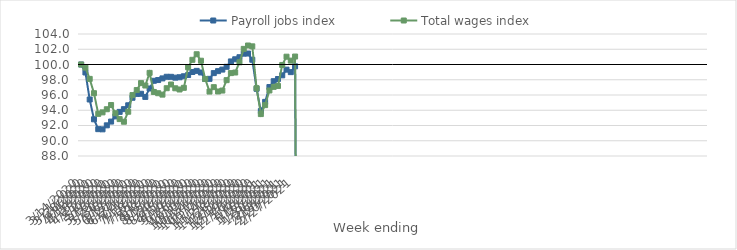
| Category | Payroll jobs index | Total wages index |
|---|---|---|
| 14/03/2020 | 100 | 100 |
| 21/03/2020 | 98.956 | 99.591 |
| 28/03/2020 | 95.412 | 98.115 |
| 04/04/2020 | 92.813 | 96.238 |
| 11/04/2020 | 91.52 | 93.527 |
| 18/04/2020 | 91.497 | 93.722 |
| 25/04/2020 | 92.022 | 94.132 |
| 02/05/2020 | 92.516 | 94.683 |
| 09/05/2020 | 93.196 | 93.606 |
| 16/05/2020 | 93.786 | 92.839 |
| 23/05/2020 | 94.143 | 92.495 |
| 30/05/2020 | 94.652 | 93.805 |
| 06/06/2020 | 95.638 | 95.989 |
| 13/06/2020 | 96.141 | 96.647 |
| 20/06/2020 | 96.161 | 97.556 |
| 27/06/2020 | 95.749 | 97.243 |
| 04/07/2020 | 96.855 | 98.903 |
| 11/07/2020 | 97.864 | 96.396 |
| 18/07/2020 | 97.96 | 96.236 |
| 25/07/2020 | 98.177 | 96.05 |
| 01/08/2020 | 98.391 | 96.89 |
| 08/08/2020 | 98.384 | 97.377 |
| 15/08/2020 | 98.275 | 96.882 |
| 22/08/2020 | 98.328 | 96.723 |
| 29/08/2020 | 98.458 | 96.942 |
| 05/09/2020 | 98.618 | 99.637 |
| 12/09/2020 | 99.017 | 100.615 |
| 19/09/2020 | 99.166 | 101.346 |
| 26/09/2020 | 98.953 | 100.497 |
| 03/10/2020 | 98.095 | 98.1 |
| 10/10/2020 | 98.121 | 96.45 |
| 17/10/2020 | 98.87 | 97.028 |
| 24/10/2020 | 99.128 | 96.463 |
| 31/10/2020 | 99.332 | 96.583 |
| 07/11/2020 | 99.7 | 97.947 |
| 14/11/2020 | 100.404 | 98.872 |
| 21/11/2020 | 100.686 | 98.947 |
| 28/11/2020 | 100.954 | 100.289 |
| 05/12/2020 | 101.418 | 102.049 |
| 12/12/2020 | 101.44 | 102.491 |
| 19/12/2020 | 100.619 | 102.382 |
| 26/12/2020 | 96.814 | 96.897 |
| 02/01/2021 | 93.894 | 93.496 |
| 09/01/2021 | 95.102 | 94.672 |
| 16/01/2021 | 97.043 | 96.593 |
| 23/01/2021 | 97.81 | 97.069 |
| 30/01/2021 | 98.097 | 97.188 |
| 06/02/2021 | 98.579 | 99.942 |
| 13/02/2021 | 99.324 | 101.024 |
| 20/02/2021 | 98.998 | 100.508 |
| 27/02/2021 | 99.758 | 101.044 |